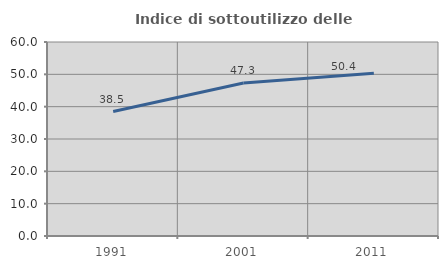
| Category | Indice di sottoutilizzo delle abitazioni  |
|---|---|
| 1991.0 | 38.494 |
| 2001.0 | 47.321 |
| 2011.0 | 50.358 |